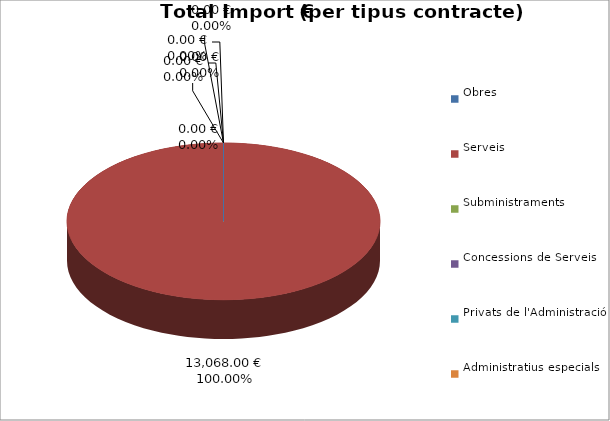
| Category | Total preu
(amb IVA) |
|---|---|
| Obres | 0 |
| Serveis | 13068 |
| Subministraments | 0 |
| Concessions de Serveis | 0 |
| Privats de l'Administració | 0 |
| Administratius especials | 0 |